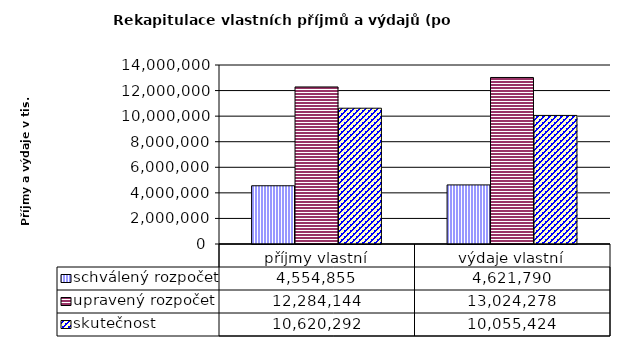
| Category | schválený rozpočet | upravený rozpočet | skutečnost |
|---|---|---|---|
| příjmy vlastní | 4554855 | 12284144 | 10620292 |
| výdaje vlastní | 4621790 | 13024278 | 10055424 |